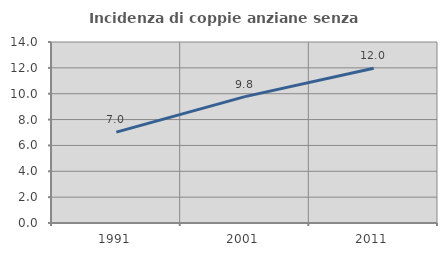
| Category | Incidenza di coppie anziane senza figli  |
|---|---|
| 1991.0 | 7.029 |
| 2001.0 | 9.775 |
| 2011.0 | 11.974 |